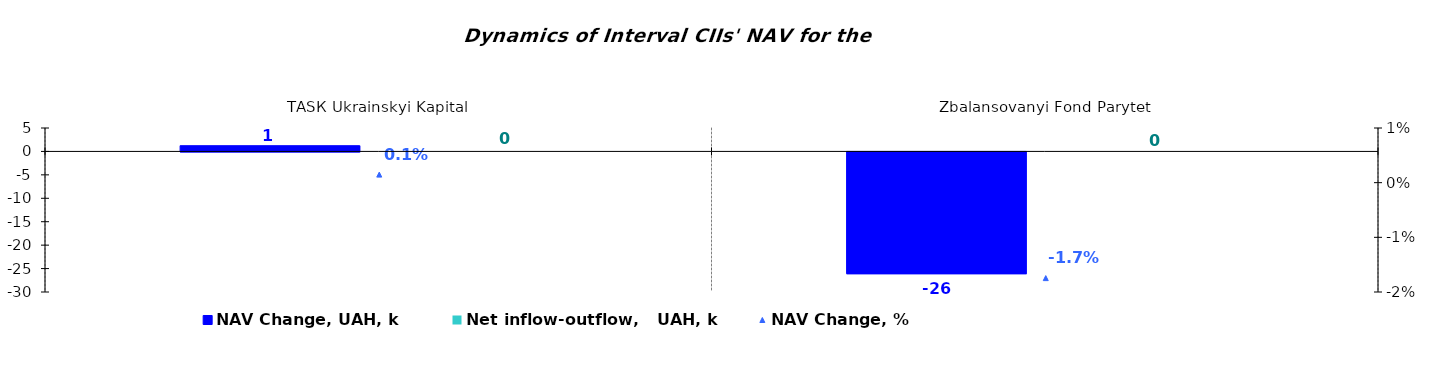
| Category | NAV Change, UAH, k | Net inflow-outflow,   UAH, k |
|---|---|---|
| ТАSК Ukrainskyi Kapital | 1.225 | 0 |
| Zbalansovanyi Fond Parytet | -25.986 | 0 |